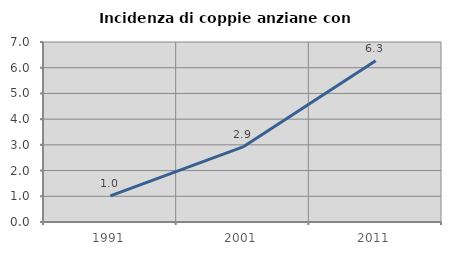
| Category | Incidenza di coppie anziane con figli |
|---|---|
| 1991.0 | 1.017 |
| 2001.0 | 2.92 |
| 2011.0 | 6.273 |